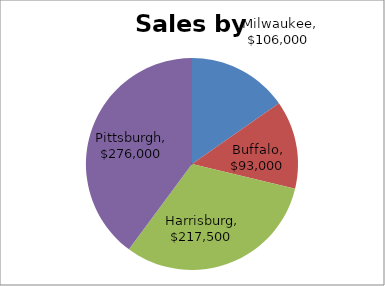
| Category | Series 0 |
|---|---|
| Milwaukee | 106000 |
| Buffalo | 93000 |
| Harrisburg | 217500 |
| Pittsburgh | 276000 |